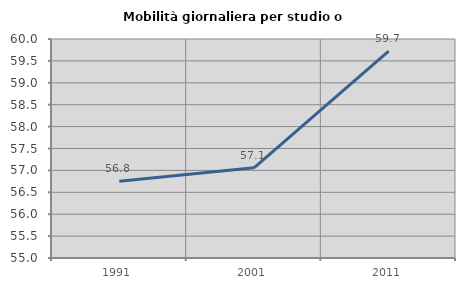
| Category | Mobilità giornaliera per studio o lavoro |
|---|---|
| 1991.0 | 56.753 |
| 2001.0 | 57.06 |
| 2011.0 | 59.723 |